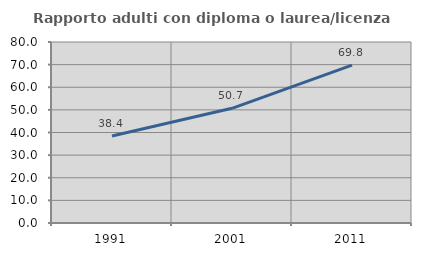
| Category | Rapporto adulti con diploma o laurea/licenza media  |
|---|---|
| 1991.0 | 38.445 |
| 2001.0 | 50.69 |
| 2011.0 | 69.788 |